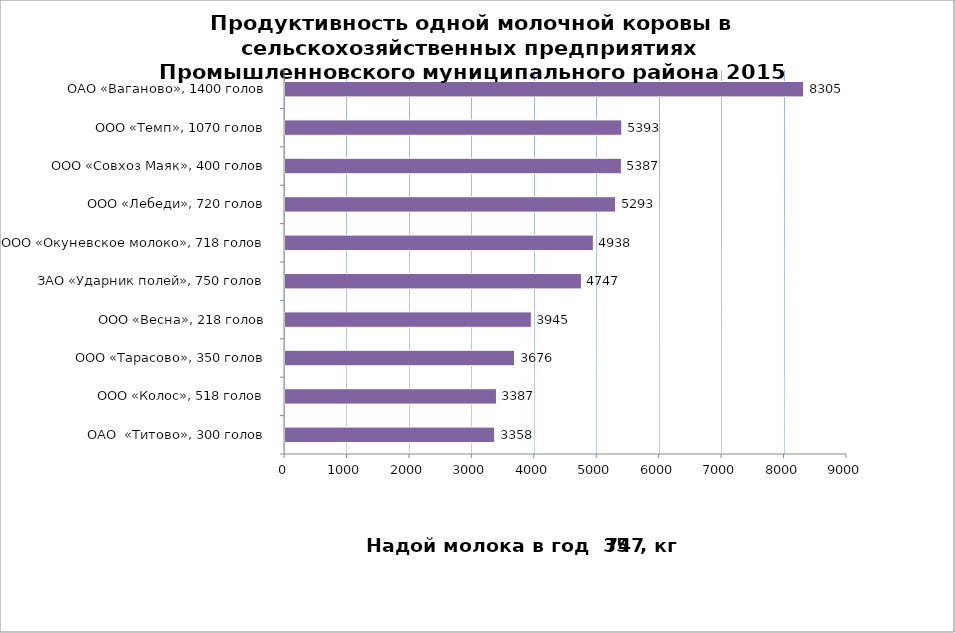
| Category | Series 0 |
|---|---|
| ОАО  «Титово», 300 голов | 3358 |
| ООО «Колос», 518 голов | 3387 |
| ООО «Тарасово», 350 голов | 3676 |
| ООО «Весна», 218 голов | 3945 |
| ЗАО «Ударник полей», 750 голов | 4747 |
| ООО «Окуневское молоко», 718 голов | 4938 |
| ООО «Лебеди», 720 голов | 5293 |
| ООО «Совхоз Маяк», 400 голов | 5387 |
| ООО «Темп», 1070 голов | 5393 |
| ОАО «Ваганово», 1400 голов | 8305 |